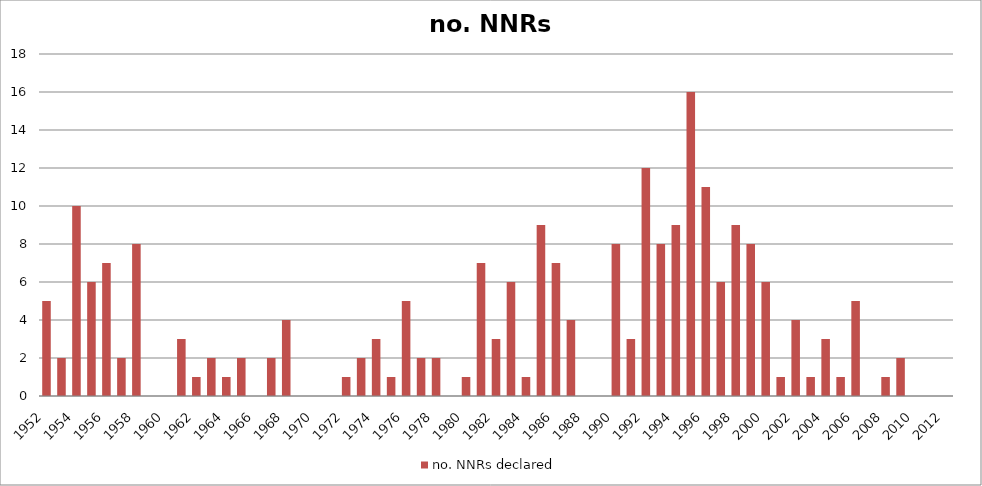
| Category | no. NNRs declared |
|---|---|
| 1952.0 | 5 |
| 1953.0 | 2 |
| 1954.0 | 10 |
| 1955.0 | 6 |
| 1956.0 | 7 |
| 1957.0 | 2 |
| 1958.0 | 8 |
| 1959.0 | 0 |
| 1960.0 | 0 |
| 1961.0 | 3 |
| 1962.0 | 1 |
| 1963.0 | 2 |
| 1964.0 | 1 |
| 1965.0 | 2 |
| 1966.0 | 0 |
| 1967.0 | 2 |
| 1968.0 | 4 |
| 1969.0 | 0 |
| 1970.0 | 0 |
| 1971.0 | 0 |
| 1972.0 | 1 |
| 1973.0 | 2 |
| 1974.0 | 3 |
| 1975.0 | 1 |
| 1976.0 | 5 |
| 1977.0 | 2 |
| 1978.0 | 2 |
| 1979.0 | 0 |
| 1980.0 | 1 |
| 1981.0 | 7 |
| 1982.0 | 3 |
| 1983.0 | 6 |
| 1984.0 | 1 |
| 1985.0 | 9 |
| 1986.0 | 7 |
| 1987.0 | 4 |
| 1988.0 | 0 |
| 1989.0 | 0 |
| 1990.0 | 8 |
| 1991.0 | 3 |
| 1992.0 | 12 |
| 1993.0 | 8 |
| 1994.0 | 9 |
| 1995.0 | 16 |
| 1996.0 | 11 |
| 1997.0 | 6 |
| 1998.0 | 9 |
| 1999.0 | 8 |
| 2000.0 | 6 |
| 2001.0 | 1 |
| 2002.0 | 4 |
| 2003.0 | 1 |
| 2004.0 | 3 |
| 2005.0 | 1 |
| 2006.0 | 5 |
| 2007.0 | 0 |
| 2008.0 | 1 |
| 2009.0 | 2 |
| 2010.0 | 0 |
| 2011.0 | 0 |
| 2012.0 | 0 |